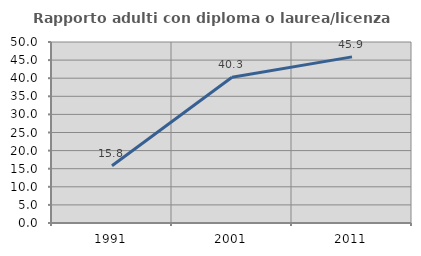
| Category | Rapporto adulti con diploma o laurea/licenza media  |
|---|---|
| 1991.0 | 15.833 |
| 2001.0 | 40.278 |
| 2011.0 | 45.89 |